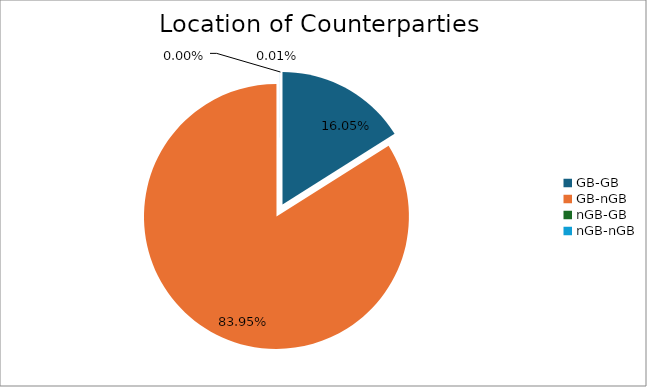
| Category | Series 0 |
|---|---|
| GB-GB | 1766571.742 |
| GB-nGB | 9240869.792 |
| nGB-GB | 16.904 |
| nGB-nGB | 689.912 |